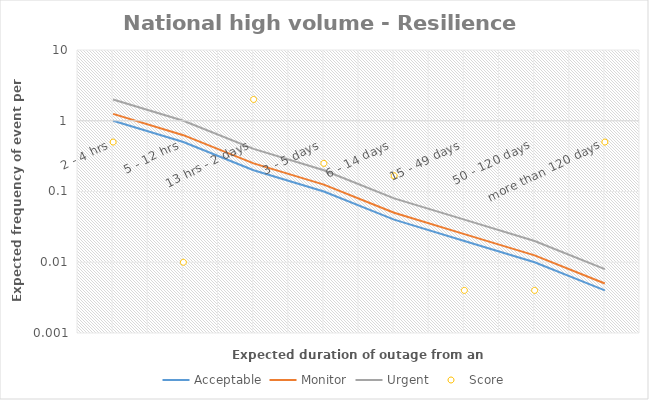
| Category | Acceptable | Monitor | Urgent | Score |
|---|---|---|---|---|
| 2 - 4 hrs | 1 | 1.25 | 2 | 0.5 |
| 5 - 12 hrs | 0.5 | 0.625 | 1 | 0.01 |
| 13 hrs - 2 days | 0.2 | 0.25 | 0.4 | 2 |
| 3 - 5 days | 0.1 | 0.125 | 0.2 | 0.25 |
| 6 - 14 days | 0.04 | 0.05 | 0.08 | 0.167 |
| 15 - 49 days | 0.02 | 0.025 | 0.04 | 0.004 |
| 50 - 120 days | 0.01 | 0.012 | 0.02 | 0.004 |
| more than 120 days | 0.004 | 0.005 | 0.008 | 0.5 |